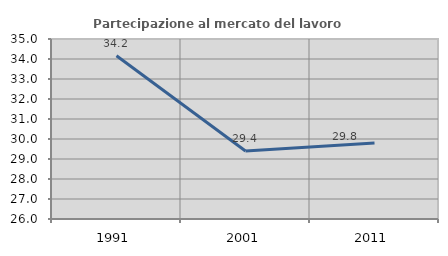
| Category | Partecipazione al mercato del lavoro  femminile |
|---|---|
| 1991.0 | 34.159 |
| 2001.0 | 29.404 |
| 2011.0 | 29.796 |